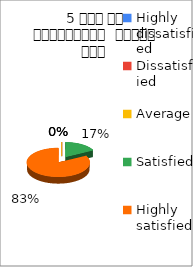
| Category | 5 समय पर पाठ्यक्रम  पूर्ण हुआ  |
|---|---|
| Highly dissatisfied | 0 |
| Dissatisfied | 0 |
| Average | 0 |
| Satisfied | 5 |
| Highly satisfied | 24 |